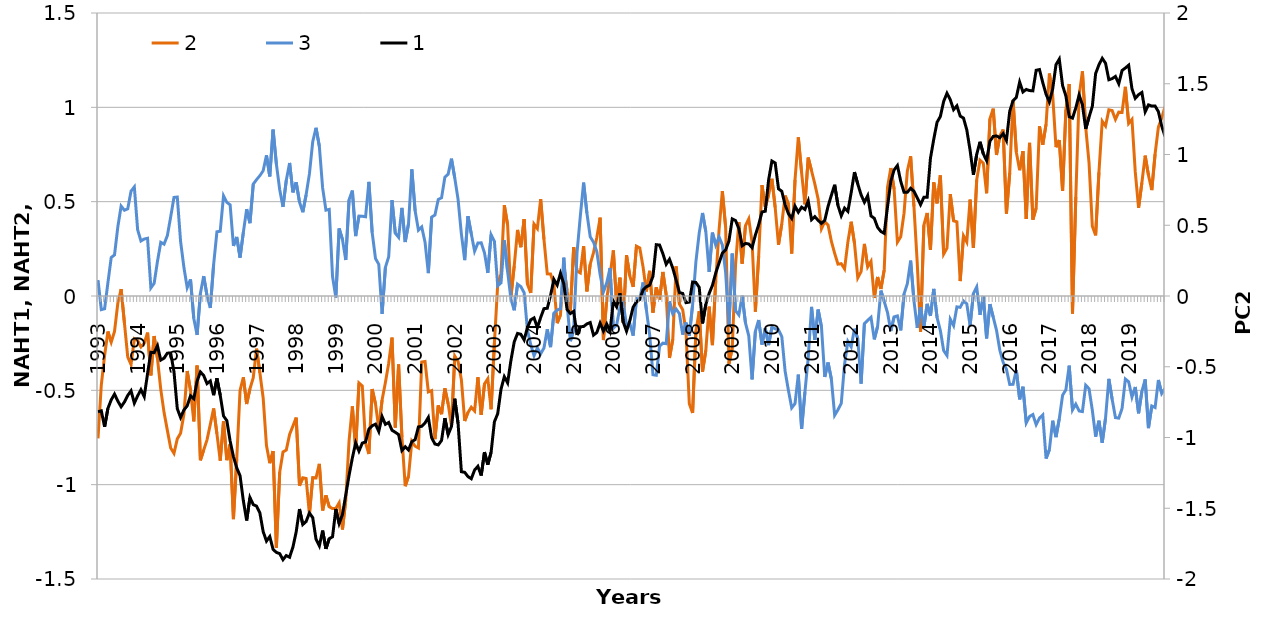
| Category | 2 | 3 |
|---|---|---|
| 1993.0 | -0.755 | 0.085 |
| nan | -0.472 | -0.072 |
| nan | -0.315 | -0.067 |
| nan | -0.189 | 0.071 |
| nan | -0.244 | 0.204 |
| nan | -0.187 | 0.218 |
| nan | -0.039 | 0.366 |
| nan | 0.037 | 0.477 |
| nan | -0.143 | 0.454 |
| nan | -0.323 | 0.462 |
| nan | -0.363 | 0.555 |
| nan | -0.227 | 0.578 |
| 1994.0 | -0.235 | 0.351 |
| nan | -0.27 | 0.292 |
| nan | -0.251 | 0.302 |
| nan | -0.194 | 0.306 |
| nan | -0.421 | 0.043 |
| nan | -0.212 | 0.067 |
| nan | -0.332 | 0.183 |
| nan | -0.495 | 0.284 |
| nan | -0.618 | 0.275 |
| nan | -0.712 | 0.32 |
| nan | -0.806 | 0.419 |
| nan | -0.834 | 0.522 |
| 1995.0 | -0.757 | 0.524 |
| nan | -0.728 | 0.29 |
| nan | -0.629 | 0.153 |
| nan | -0.398 | 0.044 |
| nan | -0.5 | 0.088 |
| nan | -0.665 | -0.119 |
| nan | -0.369 | -0.206 |
| nan | -0.871 | 0.014 |
| nan | -0.816 | 0.105 |
| nan | -0.762 | 0.002 |
| nan | -0.68 | -0.063 |
| nan | -0.596 | 0.166 |
| 1996.0 | -0.73 | 0.341 |
| nan | -0.872 | 0.343 |
| nan | -0.664 | 0.531 |
| nan | -0.87 | 0.496 |
| nan | -0.786 | 0.483 |
| nan | -1.183 | 0.265 |
| nan | -0.864 | 0.313 |
| nan | -0.501 | 0.204 |
| nan | -0.431 | 0.337 |
| nan | -0.573 | 0.461 |
| nan | -0.492 | 0.386 |
| nan | -0.432 | 0.593 |
| 1997.0 | -0.279 | 0.617 |
| nan | -0.407 | 0.638 |
| nan | -0.54 | 0.664 |
| nan | -0.793 | 0.746 |
| nan | -0.886 | 0.634 |
| nan | -0.822 | 0.882 |
| nan | -1.334 | 0.699 |
| nan | -0.935 | 0.565 |
| nan | -0.826 | 0.473 |
| nan | -0.816 | 0.614 |
| nan | -0.733 | 0.705 |
| nan | -0.69 | 0.549 |
| 1998.0 | -0.645 | 0.603 |
| nan | -1.005 | 0.498 |
| nan | -0.963 | 0.444 |
| nan | -0.967 | 0.537 |
| nan | -1.156 | 0.647 |
| nan | -0.962 | 0.817 |
| nan | -0.964 | 0.892 |
| nan | -0.89 | 0.794 |
| nan | -1.137 | 0.573 |
| nan | -1.057 | 0.455 |
| nan | -1.117 | 0.459 |
| nan | -1.127 | 0.103 |
| 1999.0 | -1.126 | -0.008 |
| nan | -1.096 | 0.358 |
| nan | -1.238 | 0.3 |
| nan | -1.082 | 0.191 |
| nan | -0.767 | 0.51 |
| nan | -0.585 | 0.559 |
| nan | -0.811 | 0.318 |
| nan | -0.461 | 0.424 |
| nan | -0.477 | 0.423 |
| nan | -0.779 | 0.42 |
| nan | -0.837 | 0.605 |
| nan | -0.493 | 0.336 |
| 2000.0 | -0.572 | 0.199 |
| nan | -0.702 | 0.168 |
| nan | -0.552 | -0.095 |
| nan | -0.458 | 0.152 |
| nan | -0.357 | 0.208 |
| nan | -0.221 | 0.508 |
| nan | -0.697 | 0.333 |
| nan | -0.363 | 0.311 |
| nan | -0.747 | 0.467 |
| nan | -1.008 | 0.286 |
| nan | -0.955 | 0.383 |
| nan | -0.77 | 0.671 |
| 2001.0 | -0.796 | 0.451 |
| nan | -0.806 | 0.349 |
| nan | -0.35 | 0.366 |
| nan | -0.347 | 0.285 |
| nan | -0.508 | 0.121 |
| nan | -0.502 | 0.418 |
| nan | -0.758 | 0.429 |
| nan | -0.58 | 0.511 |
| nan | -0.626 | 0.52 |
| nan | -0.489 | 0.63 |
| nan | -0.572 | 0.646 |
| nan | -0.69 | 0.728 |
| 2002.0 | -0.318 | 0.625 |
| nan | -0.347 | 0.512 |
| nan | -0.444 | 0.329 |
| nan | -0.662 | 0.19 |
| nan | -0.617 | 0.423 |
| nan | -0.59 | 0.33 |
| nan | -0.609 | 0.238 |
| nan | -0.431 | 0.281 |
| nan | -0.63 | 0.282 |
| nan | -0.466 | 0.229 |
| nan | -0.439 | 0.122 |
| nan | -0.6 | 0.325 |
| 2003.0 | -0.249 | 0.289 |
| nan | 0.062 | 0.054 |
| nan | 0.117 | 0.07 |
| nan | 0.481 | 0.295 |
| nan | 0.377 | 0.13 |
| nan | -0.004 | -0.016 |
| nan | 0.16 | -0.076 |
| nan | 0.35 | 0.063 |
| nan | 0.259 | 0.05 |
| nan | 0.408 | 0.017 |
| nan | 0.062 | -0.181 |
| nan | 0.016 | -0.258 |
| 2004.0 | 0.381 | -0.316 |
| nan | 0.357 | -0.275 |
| nan | 0.513 | -0.307 |
| nan | 0.301 | -0.275 |
| nan | 0.117 | -0.176 |
| nan | 0.117 | -0.271 |
| nan | 0.063 | -0.092 |
| nan | -0.144 | -0.074 |
| nan | -0.1 | -0.067 |
| nan | 0.159 | 0.203 |
| nan | 0.027 | -0.044 |
| nan | -0.08 | -0.239 |
| 2005.0 | 0.259 | -0.18 |
| nan | 0.132 | 0.227 |
| nan | 0.122 | 0.422 |
| nan | 0.265 | 0.601 |
| nan | 0.025 | 0.44 |
| nan | 0.169 | 0.314 |
| nan | 0.23 | 0.286 |
| nan | 0.31 | 0.236 |
| nan | 0.415 | 0.114 |
| nan | -0.234 | 0.022 |
| nan | -0.018 | 0.07 |
| nan | 0.108 | 0.148 |
| 2006.0 | 0.241 | -0.171 |
| nan | -0.047 | -0.154 |
| nan | 0.097 | -0.062 |
| nan | -0.142 | -0.041 |
| nan | 0.216 | -0.154 |
| nan | 0.106 | -0.146 |
| nan | 0.048 | -0.21 |
| nan | 0.264 | -0.014 |
| nan | 0.255 | -0.017 |
| nan | 0.154 | 0.072 |
| nan | 0.024 | -0.072 |
| nan | 0.134 | -0.205 |
| 2007.0 | -0.088 | -0.417 |
| nan | 0.046 | -0.42 |
| nan | -0.02 | -0.266 |
| nan | 0.127 | -0.249 |
| nan | 0.007 | -0.253 |
| nan | -0.328 | -0.029 |
| nan | -0.23 | -0.094 |
| nan | 0.157 | -0.069 |
| nan | -0.043 | -0.093 |
| nan | -0.073 | -0.205 |
| nan | -0.191 | -0.141 |
| nan | -0.571 | -0.211 |
| 2008.0 | -0.62 | -0.046 |
| nan | -0.186 | 0.182 |
| nan | -0.08 | 0.334 |
| nan | -0.401 | 0.44 |
| nan | -0.287 | 0.341 |
| nan | -0.056 | 0.127 |
| nan | -0.261 | 0.336 |
| nan | 0.082 | 0.27 |
| nan | 0.349 | 0.313 |
| nan | 0.555 | 0.271 |
| nan | 0.364 | 0.124 |
| nan | -0.359 | -0.157 |
| 2009.0 | -0.276 | 0.224 |
| nan | 0.166 | -0.078 |
| nan | 0.392 | -0.1 |
| nan | 0.172 | 0.002 |
| nan | 0.372 | -0.143 |
| nan | 0.409 | -0.211 |
| nan | 0.286 | -0.442 |
| nan | -0.083 | -0.187 |
| nan | 0.211 | -0.127 |
| nan | 0.588 | -0.257 |
| nan | 0.473 | -0.171 |
| nan | 0.535 | -0.26 |
| 2010.0 | 0.621 | -0.166 |
| nan | 0.468 | -0.174 |
| nan | 0.271 | -0.179 |
| nan | 0.383 | -0.215 |
| nan | 0.532 | -0.398 |
| nan | 0.487 | -0.5 |
| nan | 0.225 | -0.593 |
| nan | 0.616 | -0.57 |
| nan | 0.841 | -0.417 |
| nan | 0.653 | -0.704 |
| nan | 0.486 | -0.51 |
| nan | 0.734 | -0.326 |
| 2011.0 | 0.664 | -0.057 |
| nan | 0.593 | -0.233 |
| nan | 0.514 | -0.072 |
| nan | 0.356 | -0.163 |
| nan | 0.394 | -0.429 |
| nan | 0.376 | -0.353 |
| nan | 0.29 | -0.44 |
| nan | 0.226 | -0.632 |
| nan | 0.169 | -0.603 |
| nan | 0.171 | -0.569 |
| nan | 0.144 | -0.362 |
| nan | 0.286 | -0.241 |
| 2012.0 | 0.394 | -0.269 |
| nan | 0.279 | -0.174 |
| nan | 0.096 | -0.226 |
| nan | 0.129 | -0.464 |
| nan | 0.276 | -0.147 |
| nan | 0.155 | -0.129 |
| nan | 0.183 | -0.113 |
| nan | -0.01 | -0.23 |
| nan | 0.101 | -0.161 |
| nan | 0.037 | 0.029 |
| nan | 0.138 | -0.029 |
| nan | 0.576 | -0.088 |
| 2013.0 | 0.678 | -0.185 |
| nan | 0.566 | -0.111 |
| nan | 0.285 | -0.106 |
| nan | 0.314 | -0.182 |
| nan | 0.439 | 0.011 |
| nan | 0.662 | 0.066 |
| nan | 0.741 | 0.187 |
| nan | 0.475 | -0.025 |
| nan | 0.175 | -0.169 |
| nan | -0.19 | -0.06 |
| nan | 0.375 | -0.167 |
| nan | 0.44 | -0.042 |
| 2014.0 | 0.245 | -0.105 |
| nan | 0.602 | 0.038 |
| nan | 0.491 | -0.114 |
| nan | 0.639 | -0.184 |
| nan | 0.222 | -0.289 |
| nan | 0.254 | -0.315 |
| nan | 0.54 | -0.123 |
| nan | 0.399 | -0.157 |
| nan | 0.393 | -0.058 |
| nan | 0.079 | -0.06 |
| nan | 0.319 | -0.026 |
| nan | 0.286 | -0.042 |
| 2015.0 | 0.511 | -0.157 |
| nan | 0.255 | 0.013 |
| nan | 0.616 | 0.048 |
| nan | 0.72 | -0.1 |
| nan | 0.704 | 0 |
| nan | 0.545 | -0.224 |
| nan | 0.94 | -0.043 |
| nan | 0.993 | -0.113 |
| nan | 0.747 | -0.182 |
| nan | 0.848 | -0.288 |
| nan | 0.882 | -0.352 |
| nan | 0.437 | -0.388 |
| 2016.0 | 0.653 | -0.469 |
| nan | 1.039 | -0.468 |
| nan | 0.762 | -0.392 |
| nan | 0.667 | -0.548 |
| nan | 0.768 | -0.481 |
| nan | 0.408 | -0.673 |
| nan | 0.812 | -0.639 |
| nan | 0.405 | -0.628 |
| nan | 0.466 | -0.682 |
| nan | 0.899 | -0.647 |
| nan | 0.802 | -0.631 |
| nan | 0.911 | -0.862 |
| 2017.0 | 1.179 | -0.814 |
| nan | 1.064 | -0.661 |
| nan | 0.789 | -0.748 |
| nan | 0.826 | -0.65 |
| nan | 0.557 | -0.526 |
| nan | 0.987 | -0.497 |
| nan | 1.124 | -0.369 |
| nan | -0.093 | -0.604 |
| nan | 0.525 | -0.573 |
| nan | 1.06 | -0.609 |
| nan | 1.191 | -0.613 |
| nan | 0.894 | -0.473 |
| 2018.0 | 0.707 | -0.491 |
| nan | 0.37 | -0.606 |
| nan | 0.322 | -0.746 |
| nan | 0.655 | -0.661 |
| nan | 0.927 | -0.778 |
| nan | 0.901 | -0.647 |
| nan | 0.987 | -0.439 |
| nan | 0.983 | -0.547 |
| nan | 0.936 | -0.645 |
| nan | 0.975 | -0.647 |
| nan | 0.973 | -0.596 |
| nan | 1.109 | -0.44 |
| 2019.0 | 0.915 | -0.455 |
| nan | 0.936 | -0.536 |
| nan | 0.658 | -0.482 |
| nan | 0.467 | -0.622 |
| nan | 0.6 | -0.506 |
| nan | 0.744 | -0.442 |
| nan | 0.639 | -0.7 |
| nan | 0.562 | -0.583 |
| nan | 0.753 | -0.591 |
| nan | 0.895 | -0.445 |
| nan | 0.943 | -0.516 |
| nan | 1.003 | -0.489 |